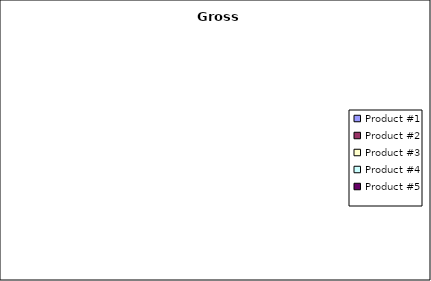
| Category | Series 0 |
|---|---|
| Product #1 | 0 |
| Product #2 | 0 |
| Product #3 | 0 |
| Product #4 | 0 |
| Product #5 | 0 |